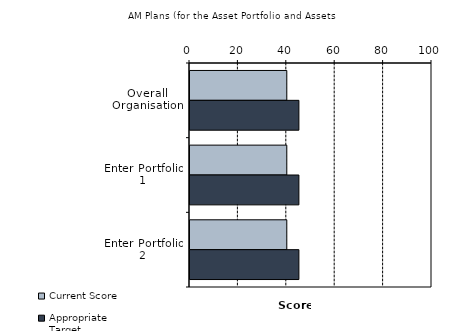
| Category | Current Score | Appropriate Target |
|---|---|---|
| Overall Organisation | 40 | 45 |
| Enter Portfolio 1 | 40 | 45 |
| Enter Portfolio 2 | 40 | 45 |